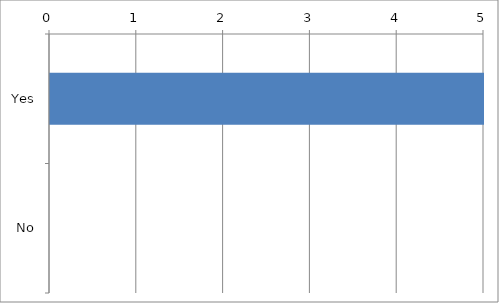
| Category | Series 0 |
|---|---|
| Yes | 5 |
| No | 0 |